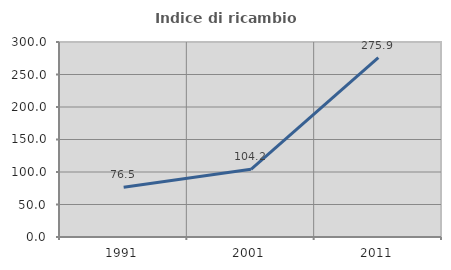
| Category | Indice di ricambio occupazionale  |
|---|---|
| 1991.0 | 76.455 |
| 2001.0 | 104.187 |
| 2011.0 | 275.921 |